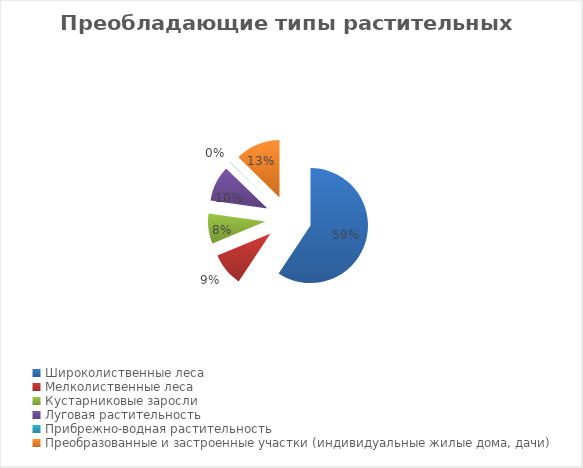
| Category | Series 0 |
|---|---|
| Широколиственные леса | 59.4 |
| Мелколиственные леса | 9.4 |
| Кустарниковые заросли | 8.5 |
| Луговая растительность | 10 |
| Прибрежно-водная растительность | 0.1 |
| Преобразованные и застроенные участки (индивидуальные жилые дома, дачи) | 12.7 |